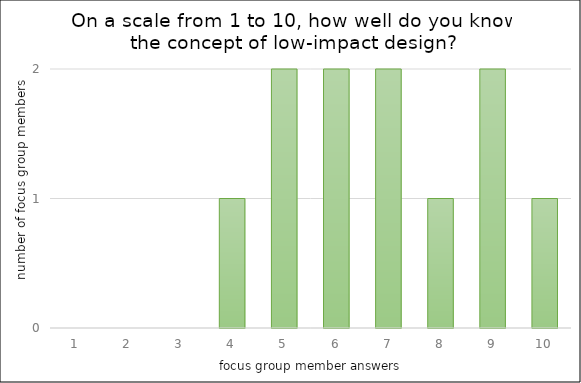
| Category | On a scale from 1 to 10, how well do you know the concept of low-impact design? |
|---|---|
| 1.0 | 0 |
| 2.0 | 0 |
| 3.0 | 0 |
| 4.0 | 1 |
| 5.0 | 2 |
| 6.0 | 2 |
| 7.0 | 2 |
| 8.0 | 1 |
| 9.0 | 2 |
| 10.0 | 1 |